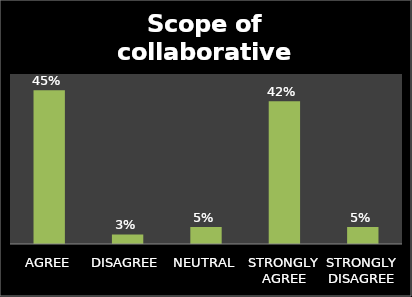
| Category | Series 0 |
|---|---|
| AGREE | 0.452 |
| DISAGREE | 0.028 |
| NEUTRAL | 0.05 |
| STRONGLY AGREE | 0.42 |
| STRONGLY DISAGREE | 0.05 |